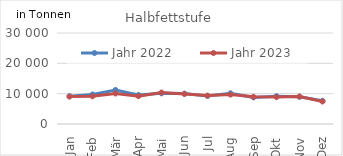
| Category | Jahr 2022 | Jahr 2023 |
|---|---|---|
| 0 | 9161.597 | 9034.077 |
| 1 | 9733.079 | 9129.03 |
| 2 | 11235.127 | 10055.359 |
| 3 | 9577.589 | 9178.365 |
| 4 | 10110.404 | 10370.753 |
| 5 | 10014.9 | 9913.483 |
| 6 | 9231.45 | 9369.091 |
| 7 | 10124.316 | 9689.423 |
| 8 | 8775.308 | 8960.492 |
| 9 | 9184.994 | 8864.668 |
| 10 | 8985.378 | 9056.4 |
| 11 | 7658.596 | 7420.886 |